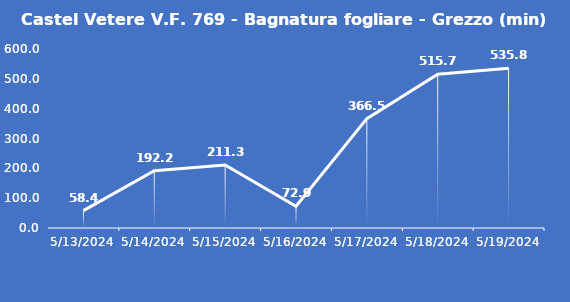
| Category | Castel Vetere V.F. 769 - Bagnatura fogliare - Grezzo (min) |
|---|---|
| 5/13/24 | 58.4 |
| 5/14/24 | 192.2 |
| 5/15/24 | 211.3 |
| 5/16/24 | 72.9 |
| 5/17/24 | 366.5 |
| 5/18/24 | 515.7 |
| 5/19/24 | 535.8 |